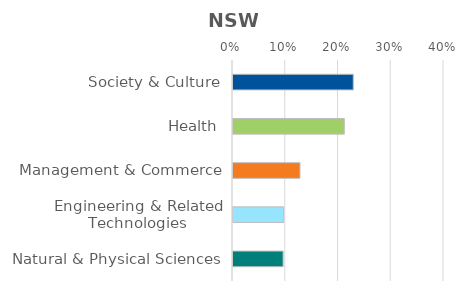
| Category | Series 0 |
|---|---|
| Society & Culture | 0.228 |
| Health | 0.211 |
| Management & Commerce | 0.127 |
| Engineering & Related Technologies | 0.096 |
| Natural & Physical Sciences | 0.095 |